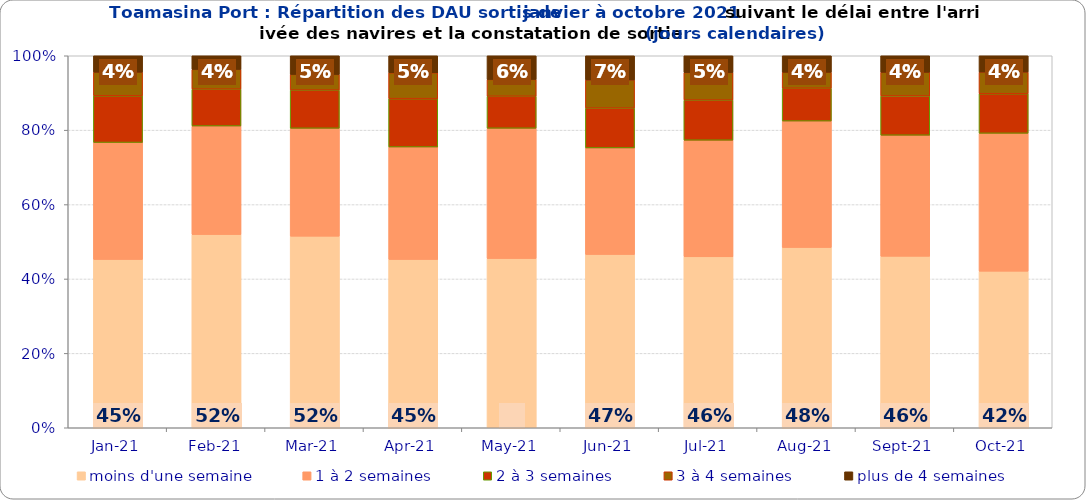
| Category | moins d'une semaine | 1 à 2 semaines | 2 à 3 semaines | 3 à 4 semaines | plus de 4 semaines |
|---|---|---|---|---|---|
| 2021-01-01 | 0.452 | 0.314 | 0.125 | 0.064 | 0.044 |
| 2021-02-01 | 0.519 | 0.292 | 0.099 | 0.053 | 0.037 |
| 2021-03-01 | 0.515 | 0.29 | 0.103 | 0.042 | 0.05 |
| 2021-04-01 | 0.452 | 0.302 | 0.13 | 0.069 | 0.046 |
| 2021-05-01 | 0.455 | 0.35 | 0.086 | 0.045 | 0.064 |
| 2021-06-01 | 0.466 | 0.287 | 0.107 | 0.076 | 0.065 |
| 2021-07-01 | 0.459 | 0.313 | 0.108 | 0.074 | 0.045 |
| 2021-08-01 | 0.485 | 0.34 | 0.088 | 0.043 | 0.044 |
| 2021-09-01 | 0.461 | 0.325 | 0.106 | 0.064 | 0.044 |
| 2021-10-01 | 0.421 | 0.371 | 0.106 | 0.058 | 0.044 |